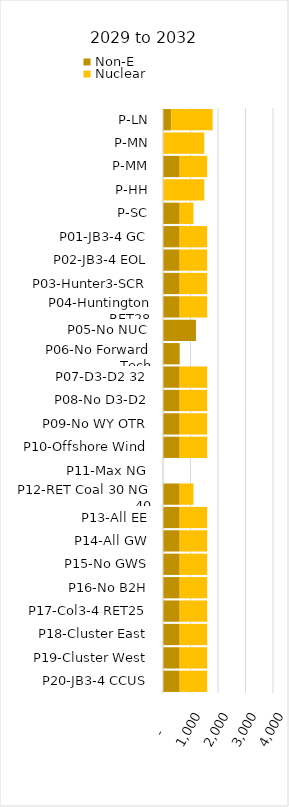
| Category | Non-E | Nuclear |
|---|---|---|
| P-LN | 303 | 1500 |
| P-MN | 0 | 1500 |
| P-MM | 606 | 1000 |
| P-HH | 0 | 1500 |
| P-SC | 606 | 500 |
| P01-JB3-4 GC | 606 | 1000 |
| P02-JB3-4 EOL | 606 | 1000 |
| P03-Hunter3-SCR | 606 | 1000 |
| P04-Huntington RET28 | 606 | 1000 |
| P05-No NUC | 1198 | 0 |
| P06-No Forward Tech | 606 | 0 |
| P07-D3-D2 32 | 606 | 1000 |
| P08-No D3-D2 | 606 | 1000 |
| P09-No WY OTR | 606 | 1000 |
| P10-Offshore Wind | 606 | 1000 |
| P11-Max NG | 0 | 0 |
| P12-RET Coal 30 NG 40 | 606 | 500 |
| P13-All EE | 606 | 1000 |
| P14-All GW | 606 | 1000 |
| P15-No GWS | 606 | 1000 |
| P16-No B2H | 606 | 1000 |
| P17-Col3-4 RET25 | 606 | 1000 |
| P18-Cluster East | 606 | 1000 |
| P19-Cluster West | 606 | 1000 |
| P20-JB3-4 CCUS | 606 | 1000 |